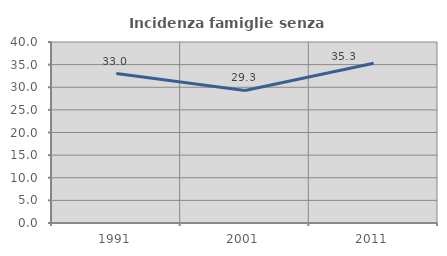
| Category | Incidenza famiglie senza nuclei |
|---|---|
| 1991.0 | 33.03 |
| 2001.0 | 29.3 |
| 2011.0 | 35.294 |